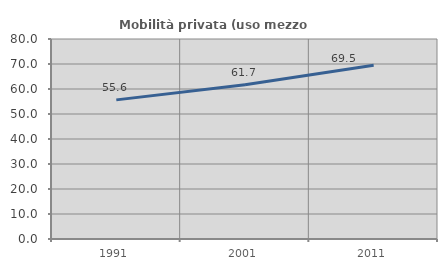
| Category | Mobilità privata (uso mezzo privato) |
|---|---|
| 1991.0 | 55.649 |
| 2001.0 | 61.667 |
| 2011.0 | 69.511 |